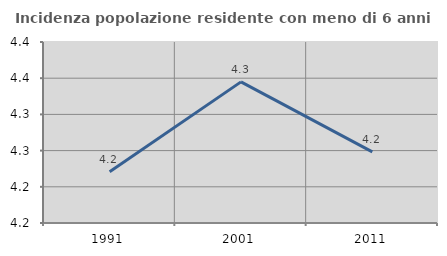
| Category | Incidenza popolazione residente con meno di 6 anni |
|---|---|
| 1991.0 | 4.221 |
| 2001.0 | 4.345 |
| 2011.0 | 4.248 |